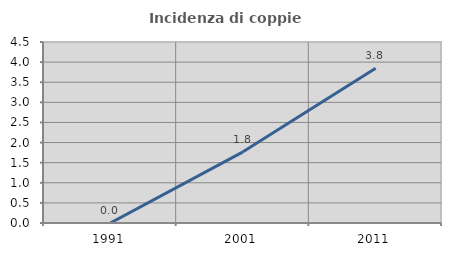
| Category | Incidenza di coppie miste |
|---|---|
| 1991.0 | 0 |
| 2001.0 | 1.77 |
| 2011.0 | 3.846 |